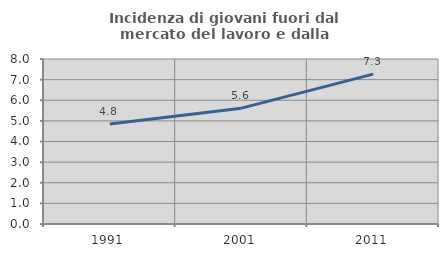
| Category | Incidenza di giovani fuori dal mercato del lavoro e dalla formazione  |
|---|---|
| 1991.0 | 4.843 |
| 2001.0 | 5.617 |
| 2011.0 | 7.267 |